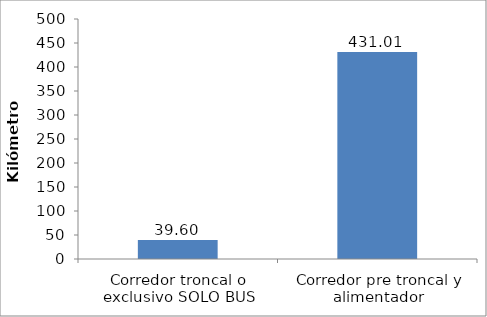
| Category | Series 0 |
|---|---|
| Corredor troncal o exclusivo SOLO BUS | 39.6 |
| Corredor pre troncal y alimentador | 431.01 |